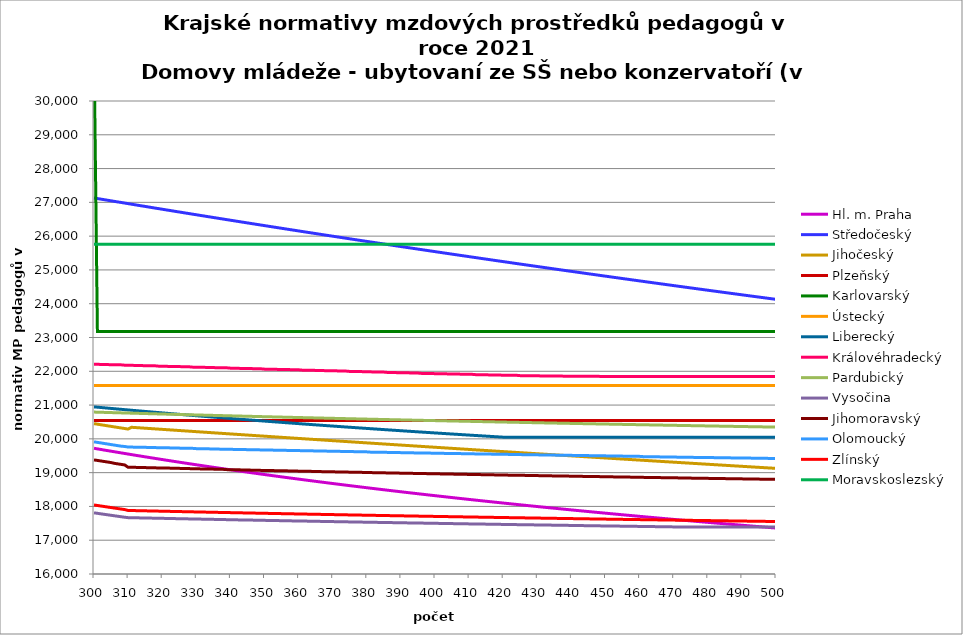
| Category | Hl. m. Praha | Středočeský | Jihočeský | Plzeňský | Karlovarský  | Ústecký   | Liberecký | Královéhradecký | Pardubický | Vysočina | Jihomoravský | Olomoucký | Zlínský | Moravskoslezský |
|---|---|---|---|---|---|---|---|---|---|---|---|---|---|---|
| 300.0 | 19720.871 | 27129.948 | 20450.699 | 20541.5 | 31680 | 21581.155 | 20946.754 | 22210.106 | 20792.359 | 17811.179 | 19377.234 | 19912.239 | 18043.404 | 25757.576 |
| 301.0 | 19703.422 | 27113.09 | 20434.307 | 20541.5 | 23180.488 | 21581.155 | 20937.493 | 22210.106 | 20789.4 | 17796.06 | 19361.435 | 19895.951 | 18027.918 | 25757.576 |
| 302.0 | 19686.062 | 27096.253 | 20417.995 | 20541.5 | 23180.488 | 21581.155 | 20928.27 | 22200.266 | 20786.452 | 17780.966 | 19345.662 | 19879.689 | 18012.509 | 25757.576 |
| 303.0 | 19668.79 | 27079.437 | 20401.764 | 20541.5 | 23180.488 | 21581.155 | 20919.086 | 22200.266 | 20783.515 | 17766.525 | 19329.915 | 19863.454 | 17997.178 | 25757.576 |
| 304.0 | 19651.605 | 27062.642 | 20385.611 | 20541.5 | 23180.488 | 21581.155 | 20909.94 | 22200.266 | 20780.588 | 17752.108 | 19314.193 | 19847.246 | 17981.923 | 25757.576 |
| 305.0 | 19634.506 | 27045.868 | 20369.537 | 20541.5 | 23180.488 | 21581.155 | 20900.832 | 22190.434 | 20777.672 | 17737.714 | 19298.497 | 19831.064 | 17966.744 | 25757.576 |
| 306.0 | 19617.492 | 27029.114 | 20353.541 | 20541.5 | 23180.488 | 21581.155 | 20891.761 | 22190.434 | 20774.766 | 17722.719 | 19275 | 19814.908 | 17951.64 | 25757.576 |
| 307.0 | 19600.564 | 27012.381 | 20337.622 | 20541.5 | 23180.488 | 21581.155 | 20882.728 | 22190.434 | 20771.87 | 17708.373 | 19259.367 | 19798.779 | 17936.611 | 25757.576 |
| 308.0 | 19583.719 | 26995.669 | 20321.779 | 20541.5 | 23180.488 | 21581.155 | 20873.733 | 22190.434 | 20768.985 | 17694.05 | 19243.76 | 19782.676 | 17921.655 | 25757.576 |
| 309.0 | 19566.958 | 26978.978 | 20306.013 | 20541.5 | 23180.488 | 21581.155 | 20864.774 | 22180.611 | 20766.109 | 17680.371 | 19228.178 | 19774.634 | 17906.773 | 25757.576 |
| 310.0 | 19550.28 | 26962.307 | 20290.321 | 20541.5 | 23180.488 | 21581.155 | 20855.852 | 22180.611 | 20763.244 | 17667.954 | 19158.37 | 19758.57 | 17880.706 | 25757.576 |
| 311.0 | 19533.683 | 26945.657 | 20342.45 | 20541.5 | 23180.488 | 21581.155 | 20846.966 | 22180.611 | 20760.389 | 17666.093 | 19158.37 | 19758.57 | 17878.46 | 25757.576 |
| 312.0 | 19517.168 | 26929.027 | 20335.61 | 20541.5 | 23180.488 | 21581.155 | 20838.116 | 22170.796 | 20757.543 | 17664.233 | 19158.37 | 19750.548 | 17876.221 | 25757.576 |
| 313.0 | 19500.734 | 26912.418 | 20328.774 | 20541.5 | 23180.488 | 21581.155 | 20829.302 | 22170.796 | 20754.708 | 17661.752 | 19150.645 | 19750.548 | 17873.991 | 25757.576 |
| 314.0 | 19484.379 | 26895.829 | 20321.943 | 20541.5 | 23180.488 | 21581.155 | 20820.523 | 22170.796 | 20751.882 | 17659.893 | 19150.645 | 19750.548 | 17871.768 | 25757.576 |
| 315.0 | 19468.104 | 26879.261 | 20315.116 | 20541.5 | 23180.488 | 21581.155 | 20811.78 | 22160.991 | 20749.066 | 17658.033 | 19150.645 | 19750.548 | 17869.553 | 25757.576 |
| 316.0 | 19451.907 | 26862.713 | 20308.293 | 20541.5 | 23180.488 | 21581.155 | 20803.072 | 22160.991 | 20746.26 | 17655.555 | 19142.926 | 19742.532 | 17867.345 | 25757.576 |
| 317.0 | 19435.789 | 26846.185 | 20301.476 | 20541.5 | 23180.488 | 21581.155 | 20794.398 | 22160.991 | 20743.463 | 17653.696 | 19142.926 | 19742.532 | 17865.145 | 25757.576 |
| 318.0 | 19419.747 | 26829.678 | 20294.663 | 20541.5 | 23180.488 | 21581.155 | 20785.759 | 22160.991 | 20740.676 | 17651.838 | 19142.926 | 19742.532 | 17862.952 | 25757.576 |
| 319.0 | 19403.783 | 26813.191 | 20287.854 | 20541.5 | 23180.488 | 21581.155 | 20777.155 | 22151.194 | 20737.899 | 17649.362 | 19135.214 | 19734.523 | 17860.767 | 25757.576 |
| 320.0 | 19387.894 | 26796.725 | 20281.05 | 20541.5 | 23180.488 | 21581.155 | 20768.584 | 22151.194 | 20735.131 | 17647.504 | 19135.214 | 19734.523 | 17858.589 | 25757.576 |
| 321.0 | 19372.081 | 26780.278 | 20274.251 | 20541.5 | 23180.488 | 21581.155 | 20760.047 | 22151.194 | 20732.372 | 17645.648 | 19135.214 | 19734.523 | 17856.419 | 25757.576 |
| 322.0 | 19356.343 | 26763.852 | 20267.456 | 20541.5 | 23180.488 | 21581.155 | 20751.544 | 22141.405 | 20729.623 | 17642.554 | 19135.214 | 19734.523 | 17854.255 | 25757.576 |
| 323.0 | 19340.679 | 26747.446 | 20260.666 | 20541.5 | 23180.488 | 21581.155 | 20743.074 | 22141.405 | 20726.882 | 17640.698 | 19127.507 | 19726.521 | 17852.099 | 25757.576 |
| 324.0 | 19325.088 | 26731.06 | 20253.88 | 20541.5 | 23180.488 | 21581.155 | 20734.637 | 22141.405 | 20724.151 | 17638.843 | 19127.507 | 19726.521 | 17849.95 | 25757.576 |
| 325.0 | 19309.571 | 26714.694 | 20247.099 | 20541.5 | 23180.488 | 21581.155 | 20726.232 | 22141.405 | 20721.43 | 17636.988 | 19127.507 | 19726.521 | 17847.809 | 25757.576 |
| 326.0 | 19294.126 | 26698.348 | 20240.323 | 20541.5 | 23180.488 | 21581.155 | 20717.861 | 22131.625 | 20718.717 | 17634.516 | 19119.807 | 19718.525 | 17845.674 | 25757.576 |
| 327.0 | 19278.753 | 26682.022 | 20233.55 | 20541.5 | 23180.488 | 21581.155 | 20709.522 | 22131.625 | 20716.013 | 17632.662 | 19119.807 | 19718.525 | 17843.547 | 25757.576 |
| 328.0 | 19263.452 | 26665.716 | 20226.783 | 20541.5 | 23180.488 | 21581.155 | 20701.214 | 22131.625 | 20713.318 | 17630.808 | 19119.807 | 19718.525 | 17841.426 | 25757.576 |
| 329.0 | 19248.221 | 26649.43 | 20220.02 | 20541.5 | 23180.488 | 21581.155 | 20692.939 | 22121.854 | 20710.632 | 17628.337 | 19112.113 | 19718.525 | 17839.312 | 25757.576 |
| 330.0 | 19233.06 | 26633.164 | 20213.261 | 20541.5 | 23180.488 | 21581.155 | 20684.696 | 22121.854 | 20707.955 | 17627.102 | 19112.113 | 19710.535 | 17837.206 | 25757.576 |
| 331.0 | 19217.969 | 26616.917 | 20206.507 | 20541.5 | 23180.488 | 21581.155 | 20676.484 | 22121.854 | 20705.287 | 17625.25 | 19112.113 | 19710.535 | 17835.106 | 25757.576 |
| 332.0 | 19202.947 | 26600.691 | 20199.758 | 20541.5 | 23180.488 | 21581.155 | 20668.303 | 22121.854 | 20702.627 | 17622.78 | 19104.425 | 19710.535 | 17833.013 | 25757.576 |
| 333.0 | 19187.993 | 26584.484 | 20193.013 | 20541.5 | 23180.488 | 21581.155 | 20660.153 | 22112.092 | 20699.977 | 17620.929 | 19104.425 | 19710.535 | 17830.927 | 25757.576 |
| 334.0 | 19173.107 | 26568.297 | 20186.272 | 20541.5 | 23180.488 | 21581.155 | 20652.035 | 22112.092 | 20697.334 | 17619.078 | 19104.425 | 19702.552 | 17828.847 | 25757.576 |
| 335.0 | 19158.289 | 26552.13 | 20179.536 | 20541.5 | 23180.488 | 21581.155 | 20643.946 | 22112.092 | 20694.701 | 17617.227 | 19104.425 | 19702.552 | 17826.774 | 25757.576 |
| 336.0 | 19143.538 | 26535.982 | 20172.805 | 20541.5 | 23180.488 | 21581.155 | 20635.889 | 22102.338 | 20692.076 | 17614.76 | 19096.743 | 19702.552 | 17824.708 | 25757.576 |
| 337.0 | 19128.854 | 26519.854 | 20166.078 | 20541.5 | 23180.488 | 21581.155 | 20627.861 | 22102.338 | 20689.459 | 17612.91 | 19096.743 | 19694.575 | 17822.649 | 25757.576 |
| 338.0 | 19114.235 | 26503.746 | 20159.356 | 20541.5 | 23180.488 | 21581.155 | 20619.863 | 22102.338 | 20686.851 | 17611.061 | 19096.743 | 19694.575 | 17820.596 | 25757.576 |
| 339.0 | 19099.682 | 26487.657 | 20152.638 | 20541.5 | 23180.488 | 21581.155 | 20611.896 | 22102.338 | 20684.251 | 17608.595 | 19089.068 | 19694.575 | 17818.549 | 25757.576 |
| 340.0 | 19085.193 | 26471.587 | 20145.924 | 20541.5 | 23180.488 | 21581.155 | 20603.957 | 22092.593 | 20681.659 | 17606.747 | 19089.068 | 19694.575 | 17816.509 | 25757.576 |
| 341.0 | 19070.769 | 26455.538 | 20139.215 | 20541.5 | 23180.488 | 21581.155 | 20596.049 | 22092.593 | 20679.076 | 17604.899 | 19089.068 | 19686.605 | 17814.476 | 25757.576 |
| 342.0 | 19056.409 | 26439.507 | 20132.51 | 20541.5 | 23180.488 | 21581.155 | 20588.169 | 22092.593 | 20676.501 | 17602.435 | 19089.068 | 19686.605 | 17812.449 | 25757.576 |
| 343.0 | 19042.112 | 26423.496 | 20125.81 | 20541.5 | 23180.488 | 21581.155 | 20580.318 | 22082.856 | 20673.934 | 17600.588 | 19081.398 | 19686.605 | 17810.428 | 25757.576 |
| 344.0 | 19027.879 | 26407.505 | 20119.114 | 20541.5 | 23180.488 | 21581.155 | 20572.497 | 22082.856 | 20671.375 | 17598.741 | 19081.398 | 19686.605 | 17808.414 | 25757.576 |
| 345.0 | 19013.708 | 26391.532 | 20112.423 | 20541.5 | 23180.488 | 21581.155 | 20564.703 | 22082.856 | 20668.824 | 17597.51 | 19081.398 | 19678.641 | 17806.406 | 25757.576 |
| 346.0 | 18999.598 | 26375.579 | 20105.736 | 20541.5 | 23180.488 | 21581.155 | 20556.939 | 22082.856 | 20666.281 | 17595.664 | 19073.735 | 19678.641 | 17804.404 | 25757.576 |
| 347.0 | 18985.551 | 26359.646 | 20099.054 | 20541.5 | 23180.488 | 21581.155 | 20549.202 | 22073.128 | 20663.746 | 17593.818 | 19073.735 | 19678.641 | 17802.409 | 25757.576 |
| 348.0 | 18971.564 | 26343.731 | 20092.376 | 20541.5 | 23180.488 | 21581.155 | 20541.494 | 22073.128 | 20661.219 | 17591.972 | 19073.735 | 19678.641 | 17800.419 | 25757.576 |
| 349.0 | 18957.638 | 26327.836 | 20085.703 | 20541.5 | 23180.488 | 21581.155 | 20533.813 | 22073.128 | 20658.7 | 17589.512 | 19066.078 | 19670.683 | 17798.436 | 25757.576 |
| 350.0 | 18943.773 | 26311.96 | 20079.034 | 20541.5 | 23180.488 | 21581.155 | 20526.16 | 22063.408 | 20656.189 | 17587.668 | 19066.078 | 19670.683 | 17796.459 | 25757.576 |
| 351.0 | 18929.967 | 26296.103 | 20072.369 | 20541.5 | 23180.488 | 21581.155 | 20518.535 | 22063.408 | 20653.686 | 17585.824 | 19066.078 | 19670.683 | 17794.488 | 25757.576 |
| 352.0 | 18916.22 | 26280.265 | 20065.709 | 20541.5 | 23180.488 | 21581.155 | 20510.937 | 22063.408 | 20651.19 | 17583.98 | 19066.078 | 19670.683 | 17792.523 | 25757.576 |
| 353.0 | 18902.532 | 26264.446 | 20059.053 | 20541.5 | 23180.488 | 21581.155 | 20503.366 | 22063.408 | 20648.702 | 17582.136 | 19058.427 | 19662.732 | 17790.564 | 25757.576 |
| 354.0 | 18888.903 | 26248.646 | 20052.402 | 20541.5 | 23180.488 | 21581.155 | 20495.822 | 22053.697 | 20646.221 | 17580.294 | 19058.427 | 19662.732 | 17788.611 | 25757.576 |
| 355.0 | 18875.332 | 26232.866 | 20045.755 | 20541.5 | 23180.488 | 21581.155 | 20488.305 | 22053.697 | 20643.749 | 17578.451 | 19058.427 | 19662.732 | 17786.664 | 25757.576 |
| 356.0 | 18861.818 | 26217.104 | 20039.112 | 20541.5 | 23180.488 | 21581.155 | 20480.815 | 22053.697 | 20641.283 | 17575.995 | 19058.427 | 19662.732 | 17784.723 | 25757.576 |
| 357.0 | 18848.361 | 26201.361 | 20032.474 | 20541.5 | 23180.488 | 21581.155 | 20473.351 | 22053.697 | 20638.826 | 17574.153 | 19050.782 | 19654.788 | 17782.788 | 25757.576 |
| 358.0 | 18834.961 | 26185.637 | 20025.841 | 20541.5 | 23180.488 | 21581.155 | 20465.913 | 22043.995 | 20636.375 | 17572.312 | 19050.782 | 19654.788 | 17780.858 | 25757.576 |
| 359.0 | 18821.618 | 26169.932 | 20019.211 | 20541.5 | 23180.488 | 21581.155 | 20458.502 | 22043.995 | 20633.932 | 17571.084 | 19050.782 | 19654.788 | 17778.935 | 25757.576 |
| 360.0 | 18808.33 | 26154.246 | 20012.586 | 20541.5 | 23180.488 | 21581.155 | 20451.116 | 22043.995 | 20631.497 | 17568.63 | 19043.144 | 19654.788 | 17777.017 | 25757.576 |
| 361.0 | 18795.098 | 26138.578 | 20005.966 | 20541.5 | 23180.488 | 21581.155 | 20443.756 | 22034.301 | 20629.069 | 17567.403 | 19043.144 | 19646.85 | 17775.104 | 25757.576 |
| 362.0 | 18781.921 | 26122.93 | 19999.349 | 20541.5 | 23180.488 | 21581.155 | 20436.422 | 22034.301 | 20626.648 | 17565.563 | 19043.144 | 19646.85 | 17773.198 | 25757.576 |
| 363.0 | 18768.799 | 26107.3 | 19992.738 | 20541.5 | 23180.488 | 21581.155 | 20429.113 | 22034.301 | 20624.234 | 17564.337 | 19043.144 | 19646.85 | 17771.297 | 25757.576 |
| 364.0 | 18755.731 | 26091.688 | 19986.13 | 20541.5 | 23180.488 | 21581.155 | 20421.83 | 22034.301 | 20621.828 | 17561.885 | 19035.511 | 19646.85 | 17769.402 | 25757.576 |
| 365.0 | 18742.717 | 26076.096 | 19979.527 | 20541.5 | 23180.488 | 21581.155 | 20414.572 | 22024.615 | 20619.428 | 17560.046 | 19035.511 | 19638.918 | 17767.513 | 25757.576 |
| 366.0 | 18729.757 | 26060.522 | 19972.928 | 20541.5 | 23180.488 | 21581.155 | 20407.338 | 22024.615 | 20617.036 | 17558.208 | 19035.511 | 19638.918 | 17765.629 | 25757.576 |
| 367.0 | 18716.85 | 26044.966 | 19966.334 | 20541.5 | 23180.488 | 21581.155 | 20400.13 | 22024.615 | 20614.651 | 17556.37 | 19027.885 | 19638.918 | 17763.75 | 25757.576 |
| 368.0 | 18703.996 | 26029.429 | 19959.744 | 20541.5 | 23180.488 | 21581.155 | 20392.946 | 22014.938 | 20612.273 | 17554.532 | 19027.885 | 19638.918 | 17761.877 | 25757.576 |
| 369.0 | 18691.194 | 26013.911 | 19953.158 | 20541.5 | 23180.488 | 21581.155 | 20385.787 | 22014.938 | 20609.902 | 17552.695 | 19027.885 | 19630.993 | 17760.01 | 25757.576 |
| 370.0 | 18678.444 | 25998.411 | 19946.577 | 20541.5 | 23180.488 | 21581.155 | 20378.652 | 22014.938 | 20607.538 | 17550.858 | 19027.885 | 19630.993 | 17758.148 | 25757.576 |
| 371.0 | 18665.746 | 25982.93 | 19940 | 20541.5 | 23180.488 | 21581.155 | 20371.542 | 22014.938 | 20605.18 | 17549.022 | 19020.264 | 19630.993 | 17756.291 | 25757.576 |
| 372.0 | 18653.099 | 25967.467 | 19933.427 | 20541.5 | 23180.488 | 21581.155 | 20364.455 | 22005.27 | 20602.83 | 17547.186 | 19020.264 | 19630.993 | 17754.44 | 25757.576 |
| 373.0 | 18640.504 | 25952.022 | 19926.859 | 20541.5 | 23180.488 | 21581.155 | 20357.393 | 22005.27 | 20600.487 | 17545.35 | 19020.264 | 19623.074 | 17752.594 | 25757.576 |
| 374.0 | 18627.959 | 25936.596 | 19920.295 | 20541.5 | 23180.488 | 21581.155 | 20350.354 | 22005.27 | 20598.15 | 17544.126 | 19020.264 | 19623.074 | 17750.754 | 25757.576 |
| 375.0 | 18615.464 | 25921.188 | 19913.736 | 20541.5 | 23180.488 | 21581.155 | 20343.339 | 21995.61 | 20595.82 | 17541.68 | 19012.65 | 19623.074 | 17748.918 | 25757.576 |
| 376.0 | 18603.019 | 25905.799 | 19907.18 | 20541.5 | 23180.488 | 21581.155 | 20336.347 | 21995.61 | 20593.497 | 17539.845 | 19012.65 | 19623.074 | 17747.088 | 25757.576 |
| 377.0 | 18590.624 | 25890.427 | 19900.629 | 20541.5 | 23180.488 | 21581.155 | 20329.379 | 21995.61 | 20591.18 | 17538.622 | 19012.65 | 19615.161 | 17745.264 | 25757.576 |
| 378.0 | 18578.278 | 25875.074 | 19894.082 | 20541.5 | 23180.488 | 21581.155 | 20322.434 | 21995.61 | 20588.871 | 17536.789 | 19012.65 | 19615.161 | 17743.444 | 25757.576 |
| 379.0 | 18565.981 | 25859.739 | 19887.54 | 20541.5 | 23180.488 | 21581.155 | 20315.512 | 21985.959 | 20586.567 | 17534.955 | 19005.042 | 19615.161 | 17741.63 | 25757.576 |
| 380.0 | 18553.733 | 25844.423 | 19881.002 | 20541.5 | 23180.488 | 21581.155 | 20308.613 | 21985.959 | 20584.271 | 17533.733 | 19005.042 | 19615.161 | 17739.821 | 25757.576 |
| 381.0 | 18541.533 | 25829.124 | 19874.468 | 20541.5 | 23180.488 | 21581.155 | 20301.737 | 21985.959 | 20581.981 | 17531.9 | 19005.042 | 19607.255 | 17738.016 | 25757.576 |
| 382.0 | 18529.381 | 25813.843 | 19867.939 | 20541.5 | 23180.488 | 21581.155 | 20294.883 | 21976.316 | 20579.697 | 17530.068 | 18997.44 | 19607.255 | 17736.217 | 25757.576 |
| 383.0 | 18517.277 | 25798.581 | 19861.413 | 20541.5 | 23180.488 | 21581.155 | 20288.052 | 21976.316 | 20577.42 | 17528.235 | 18997.44 | 19607.255 | 17734.424 | 25757.576 |
| 384.0 | 18505.219 | 25783.337 | 19854.892 | 20541.5 | 23180.488 | 21581.155 | 20281.243 | 21976.316 | 20575.149 | 17526.404 | 18997.44 | 19607.255 | 17732.635 | 25757.576 |
| 385.0 | 18493.209 | 25768.11 | 19848.376 | 20541.5 | 23180.488 | 21581.155 | 20274.457 | 21976.316 | 20572.885 | 17525.183 | 18997.44 | 19607.255 | 17730.851 | 25757.576 |
| 386.0 | 18481.246 | 25752.902 | 19841.863 | 20541.5 | 23180.488 | 21581.155 | 20267.693 | 21966.681 | 20570.627 | 17522.742 | 18989.844 | 19599.355 | 17729.072 | 25757.576 |
| 387.0 | 18469.329 | 25737.711 | 19835.355 | 20541.5 | 23180.488 | 21581.155 | 20260.95 | 21966.681 | 20568.376 | 17521.521 | 18989.844 | 19599.355 | 17727.298 | 25757.576 |
| 388.0 | 18457.458 | 25722.539 | 19828.851 | 20541.5 | 23180.488 | 21581.155 | 20254.23 | 21966.681 | 20566.13 | 17519.691 | 18989.844 | 19599.355 | 17725.529 | 25757.576 |
| 389.0 | 18445.632 | 25707.384 | 19822.352 | 20541.5 | 23180.488 | 21581.155 | 20247.531 | 21957.055 | 20563.891 | 17517.861 | 18989.844 | 19599.355 | 17723.765 | 25757.576 |
| 390.0 | 18433.853 | 25692.247 | 19815.857 | 20541.5 | 23180.488 | 21581.155 | 20240.854 | 21957.055 | 20561.659 | 17516.031 | 18982.254 | 19591.462 | 17722.006 | 25757.576 |
| 391.0 | 18422.118 | 25677.128 | 19809.365 | 20541.5 | 23180.488 | 21581.155 | 20234.198 | 21957.055 | 20559.432 | 17514.202 | 18982.254 | 19591.462 | 17720.251 | 25757.576 |
| 392.0 | 18410.428 | 25662.027 | 19802.879 | 20541.5 | 23180.488 | 21581.155 | 20227.564 | 21957.055 | 20557.212 | 17512.983 | 18982.254 | 19591.462 | 17718.502 | 25757.576 |
| 393.0 | 18398.783 | 25646.944 | 19796.396 | 20541.5 | 23180.488 | 21581.155 | 20220.951 | 21947.438 | 20554.998 | 17511.154 | 18982.254 | 19591.462 | 17716.757 | 25757.576 |
| 394.0 | 18387.182 | 25631.878 | 19789.918 | 20541.5 | 23180.488 | 21581.155 | 20214.359 | 21947.438 | 20552.789 | 17509.326 | 18974.67 | 19583.575 | 17715.017 | 25757.576 |
| 395.0 | 18375.624 | 25616.83 | 19783.444 | 20541.5 | 23180.488 | 21581.155 | 20207.788 | 21947.438 | 20550.587 | 17507.499 | 18974.67 | 19583.575 | 17713.282 | 25757.576 |
| 396.0 | 18364.111 | 25601.799 | 19776.974 | 20541.5 | 23180.488 | 21581.155 | 20201.238 | 21937.828 | 20548.391 | 17506.889 | 18974.67 | 19583.575 | 17711.551 | 25757.576 |
| 397.0 | 18352.641 | 25586.787 | 19770.508 | 20541.5 | 23180.488 | 21581.155 | 20194.709 | 21937.828 | 20546.201 | 17505.062 | 18974.67 | 19583.575 | 17709.826 | 25757.576 |
| 398.0 | 18341.214 | 25571.791 | 19764.047 | 20541.5 | 23180.488 | 21581.155 | 20188.2 | 21937.828 | 20544.017 | 17503.235 | 18967.093 | 19583.575 | 17708.105 | 25757.576 |
| 399.0 | 18329.83 | 25556.814 | 19757.59 | 20541.5 | 23180.488 | 21581.155 | 20181.712 | 21937.828 | 20541.839 | 17501.409 | 18967.093 | 19575.694 | 17706.388 | 25757.576 |
| 400.0 | 18318.489 | 25541.854 | 19751.137 | 20541.5 | 23180.488 | 21581.155 | 20175.244 | 21928.228 | 20539.667 | 17500.191 | 18967.093 | 19575.694 | 17704.676 | 25757.576 |
| 401.0 | 18307.19 | 25526.911 | 19744.688 | 20541.5 | 23180.488 | 21581.155 | 20168.797 | 21928.228 | 20537.501 | 17498.365 | 18967.093 | 19575.694 | 17702.969 | 25757.576 |
| 402.0 | 18295.932 | 25511.986 | 19738.243 | 20541.5 | 23180.488 | 21581.155 | 20162.37 | 21928.228 | 20535.34 | 17496.54 | 18959.521 | 19575.694 | 17701.267 | 25757.576 |
| 403.0 | 18284.717 | 25497.078 | 19731.803 | 20541.5 | 23180.488 | 21581.155 | 20155.962 | 21928.228 | 20533.186 | 17494.715 | 18959.521 | 19567.82 | 17699.568 | 25757.576 |
| 404.0 | 18273.543 | 25482.188 | 19725.367 | 20541.5 | 23180.488 | 21581.155 | 20149.575 | 21918.635 | 20531.037 | 17493.498 | 18959.521 | 19567.82 | 17697.875 | 25757.576 |
| 405.0 | 18262.41 | 25467.315 | 19718.935 | 20541.5 | 23180.488 | 21581.155 | 20143.208 | 21918.635 | 20528.894 | 17491.674 | 18959.521 | 19567.82 | 17696.186 | 25757.576 |
| 406.0 | 18251.319 | 25452.46 | 19712.507 | 20541.5 | 23180.488 | 21581.155 | 20136.86 | 21918.635 | 20526.756 | 17489.85 | 18951.955 | 19567.82 | 17694.501 | 25757.576 |
| 407.0 | 18240.268 | 25437.621 | 19706.084 | 20541.5 | 23180.488 | 21581.155 | 20130.532 | 21918.635 | 20524.625 | 17488.026 | 18951.955 | 19567.82 | 17692.821 | 25757.576 |
| 408.0 | 18229.257 | 25422.801 | 19699.664 | 20541.5 | 23180.488 | 21581.155 | 20124.223 | 21909.051 | 20522.499 | 17486.811 | 18951.955 | 19559.952 | 17691.146 | 25757.576 |
| 409.0 | 18218.287 | 25407.997 | 19693.249 | 20541.5 | 23180.488 | 21581.155 | 20117.934 | 21909.051 | 20520.378 | 17484.987 | 18951.955 | 19559.952 | 17689.474 | 25757.576 |
| 410.0 | 18207.356 | 25393.21 | 19686.838 | 20541.5 | 23180.488 | 21581.155 | 20111.664 | 21909.051 | 20518.264 | 17483.165 | 18944.396 | 19559.952 | 17687.808 | 25757.576 |
| 411.0 | 18196.465 | 25378.441 | 19680.431 | 20541.5 | 23180.488 | 21581.155 | 20105.413 | 21909.051 | 20516.155 | 17481.343 | 18944.396 | 19559.952 | 17686.145 | 25757.576 |
| 412.0 | 18185.614 | 25363.689 | 19674.029 | 20541.5 | 23180.488 | 21581.155 | 20099.181 | 21899.476 | 20514.051 | 17480.128 | 18944.396 | 19552.09 | 17684.487 | 25757.576 |
| 413.0 | 18174.802 | 25348.954 | 19667.63 | 20541.5 | 23180.488 | 21581.155 | 20092.968 | 21899.476 | 20511.953 | 17478.913 | 18944.396 | 19552.09 | 17682.833 | 25757.576 |
| 414.0 | 18164.029 | 25334.237 | 19661.236 | 20541.5 | 23180.488 | 21581.155 | 20086.774 | 21899.476 | 20509.86 | 17477.092 | 18936.842 | 19552.09 | 17681.184 | 25757.576 |
| 415.0 | 18153.294 | 25319.536 | 19654.846 | 20541.5 | 23180.488 | 21581.155 | 20080.599 | 21899.476 | 20507.773 | 17475.878 | 18936.842 | 19552.09 | 17679.539 | 25757.576 |
| 416.0 | 18142.598 | 25304.852 | 19648.46 | 20541.5 | 23180.488 | 21581.155 | 20074.442 | 21889.908 | 20505.692 | 17474.057 | 18936.842 | 19552.09 | 17677.898 | 25757.576 |
| 417.0 | 18131.94 | 25290.185 | 19642.078 | 20541.5 | 23180.488 | 21581.155 | 20068.304 | 21889.908 | 20503.615 | 17472.843 | 18936.842 | 19544.235 | 17676.261 | 25757.576 |
| 418.0 | 18121.321 | 25275.536 | 19635.7 | 20541.5 | 23180.488 | 21581.155 | 20062.184 | 21889.908 | 20501.545 | 17471.023 | 18929.295 | 19544.235 | 17674.629 | 25757.576 |
| 419.0 | 18110.739 | 25260.903 | 19629.326 | 20541.5 | 23180.488 | 21581.155 | 20056.083 | 21889.908 | 20499.479 | 17469.204 | 18929.295 | 19544.235 | 17673 | 25757.576 |
| 420.0 | 18100.194 | 25246.287 | 19622.957 | 20541.5 | 23180.488 | 21581.155 | 20050 | 21880.349 | 20497.419 | 17467.991 | 18929.295 | 19544.235 | 17671.376 | 25757.576 |
| 421.0 | 18089.687 | 25231.689 | 19616.592 | 20541.5 | 23180.488 | 21581.155 | 20050 | 21880.349 | 20495.364 | 17466.171 | 18929.295 | 19544.235 | 17669.756 | 25757.576 |
| 422.0 | 18079.217 | 25217.107 | 19610.23 | 20541.5 | 23180.488 | 21581.155 | 20050 | 21880.349 | 20493.315 | 17464.353 | 18921.753 | 19536.386 | 17668.141 | 25757.576 |
| 423.0 | 18068.784 | 25202.541 | 19603.873 | 20541.5 | 23180.488 | 21581.155 | 20050 | 21880.349 | 20491.27 | 17463.14 | 18921.753 | 19536.386 | 17666.529 | 25757.576 |
| 424.0 | 18058.387 | 25187.993 | 19597.52 | 20541.5 | 23180.488 | 21581.155 | 20050 | 21880.349 | 20489.231 | 17461.322 | 18921.753 | 19536.386 | 17664.921 | 25757.576 |
| 425.0 | 18048.027 | 25173.462 | 19591.172 | 20541.5 | 23180.488 | 21581.155 | 20050 | 21870.799 | 20487.198 | 17460.11 | 18921.753 | 19536.386 | 17663.318 | 25757.576 |
| 426.0 | 18037.703 | 25158.947 | 19584.827 | 20541.5 | 23180.488 | 21581.155 | 20050 | 21870.799 | 20485.169 | 17458.899 | 18921.753 | 19528.543 | 17661.718 | 25757.576 |
| 427.0 | 18027.415 | 25144.449 | 19578.486 | 20541.5 | 23180.488 | 21581.155 | 20050 | 21870.799 | 20483.145 | 17456.476 | 18914.217 | 19528.543 | 17660.123 | 25757.576 |
| 428.0 | 18017.162 | 25129.967 | 19572.15 | 20541.5 | 23180.488 | 21581.155 | 20050 | 21870.799 | 20481.127 | 17455.265 | 18914.217 | 19528.543 | 17658.532 | 25757.576 |
| 429.0 | 18006.946 | 25115.503 | 19565.817 | 20541.5 | 23180.488 | 21581.155 | 20050 | 21870.799 | 20479.114 | 17454.053 | 18914.217 | 19528.543 | 17656.944 | 25757.576 |
| 430.0 | 17996.764 | 25101.055 | 19559.489 | 20541.5 | 23180.488 | 21581.155 | 20050 | 21870.799 | 20477.106 | 17452.237 | 18914.217 | 19528.543 | 17655.361 | 25757.576 |
| 431.0 | 17986.618 | 25086.623 | 19553.165 | 20541.5 | 23180.488 | 21581.155 | 20050 | 21861.257 | 20475.103 | 17450.421 | 18906.688 | 19520.706 | 17653.782 | 25757.576 |
| 432.0 | 17976.506 | 25072.208 | 19546.845 | 20541.5 | 23180.488 | 21581.155 | 20050 | 21861.257 | 20473.105 | 17449.211 | 18906.688 | 19520.706 | 17652.206 | 25757.576 |
| 433.0 | 17966.43 | 25057.81 | 19540.529 | 20541.5 | 23180.488 | 21581.155 | 20050 | 21861.257 | 20471.111 | 17448.001 | 18906.688 | 19520.706 | 17650.635 | 25757.576 |
| 434.0 | 17956.387 | 25043.428 | 19534.217 | 20541.5 | 23180.488 | 21581.155 | 20050 | 21861.257 | 20469.123 | 17446.791 | 18906.688 | 19520.706 | 17649.067 | 25757.576 |
| 435.0 | 17946.379 | 25029.063 | 19527.909 | 20541.5 | 23180.488 | 21581.155 | 20050 | 21861.257 | 20467.14 | 17444.976 | 18899.164 | 19520.706 | 17647.503 | 25757.576 |
| 436.0 | 17936.406 | 25014.714 | 19521.605 | 20541.5 | 23180.488 | 21581.155 | 20050 | 21861.257 | 20465.162 | 17443.162 | 18899.164 | 19512.876 | 17645.943 | 25757.576 |
| 437.0 | 17926.466 | 25000.382 | 19515.305 | 20541.5 | 23180.488 | 21581.155 | 20050 | 21861.257 | 20463.189 | 17441.952 | 18899.164 | 19512.876 | 17644.387 | 25757.576 |
| 438.0 | 17916.559 | 24986.066 | 19509.01 | 20541.5 | 23180.488 | 21581.155 | 20050 | 21851.723 | 20461.22 | 17440.743 | 18899.164 | 19512.876 | 17642.835 | 25757.576 |
| 439.0 | 17906.687 | 24971.767 | 19502.718 | 20541.5 | 23180.488 | 21581.155 | 20050 | 21851.723 | 20459.257 | 17439.534 | 18899.164 | 19512.876 | 17641.287 | 25757.576 |
| 440.0 | 17896.847 | 24957.483 | 19496.43 | 20541.5 | 23180.488 | 21581.155 | 20050 | 21851.723 | 20457.298 | 17437.117 | 18891.647 | 19512.876 | 17639.742 | 25757.576 |
| 441.0 | 17887.041 | 24943.216 | 19490.147 | 20541.5 | 23180.488 | 21581.155 | 20050 | 21851.723 | 20455.344 | 17435.908 | 18891.647 | 19505.052 | 17638.201 | 25757.576 |
| 442.0 | 17877.267 | 24928.966 | 19483.867 | 20541.5 | 23180.488 | 21581.155 | 20050 | 21851.723 | 20453.395 | 17434.7 | 18891.647 | 19505.052 | 17636.664 | 25757.576 |
| 443.0 | 17867.527 | 24914.732 | 19477.592 | 20541.5 | 23180.488 | 21581.155 | 20050 | 21851.723 | 20451.451 | 17432.888 | 18891.647 | 19505.052 | 17635.131 | 25757.576 |
| 444.0 | 17857.819 | 24900.514 | 19471.321 | 20541.5 | 23180.488 | 21581.155 | 20050 | 21851.723 | 20449.512 | 17431.076 | 18884.135 | 19505.052 | 17633.601 | 25757.576 |
| 445.0 | 17848.143 | 24886.312 | 19465.053 | 20541.5 | 23180.488 | 21581.155 | 20050 | 21851.723 | 20447.577 | 17429.868 | 18884.135 | 19505.052 | 17632.075 | 25757.576 |
| 446.0 | 17838.499 | 24872.126 | 19458.79 | 20541.5 | 23180.488 | 21581.155 | 20050 | 21851.723 | 20445.647 | 17428.661 | 18884.135 | 19497.234 | 17630.553 | 25757.576 |
| 447.0 | 17828.887 | 24857.957 | 19452.531 | 20541.5 | 23180.488 | 21581.155 | 20050 | 21851.723 | 20443.721 | 17426.85 | 18884.135 | 19497.234 | 17629.034 | 25757.576 |
| 448.0 | 17819.308 | 24843.803 | 19446.275 | 20541.5 | 23180.488 | 21581.155 | 20050 | 21851.723 | 20441.801 | 17425.039 | 18884.135 | 19497.234 | 17627.52 | 25757.576 |
| 449.0 | 17809.759 | 24829.666 | 19440.024 | 20541.5 | 23180.488 | 21581.155 | 20050 | 21842.197 | 20439.884 | 17423.832 | 18876.63 | 19497.234 | 17626.008 | 25757.576 |
| 450.0 | 17800.242 | 24815.545 | 19433.777 | 20541.5 | 23180.488 | 21581.155 | 20050 | 21842.197 | 20437.973 | 17422.625 | 18876.63 | 19497.234 | 17624.501 | 25757.576 |
| 451.0 | 17790.757 | 24801.44 | 19427.534 | 20541.5 | 23180.488 | 21581.155 | 20050 | 21842.197 | 20436.066 | 17421.419 | 18876.63 | 19489.423 | 17622.997 | 25757.576 |
| 452.0 | 17781.302 | 24787.351 | 19421.294 | 20541.5 | 23180.488 | 21581.155 | 20050 | 21842.197 | 20434.164 | 17419.609 | 18876.63 | 19489.423 | 17621.496 | 25757.576 |
| 453.0 | 17771.879 | 24773.278 | 19415.059 | 20541.5 | 23180.488 | 21581.155 | 20050 | 21842.197 | 20432.266 | 17418.403 | 18869.13 | 19489.423 | 17619.999 | 25757.576 |
| 454.0 | 17762.486 | 24759.221 | 19408.828 | 20541.5 | 23180.488 | 21581.155 | 20050 | 21842.197 | 20430.373 | 17417.197 | 18869.13 | 19489.423 | 17618.506 | 25757.576 |
| 455.0 | 17753.124 | 24745.18 | 19402.601 | 20541.5 | 23180.488 | 21581.155 | 20050 | 21842.197 | 20428.484 | 17415.992 | 18869.13 | 19489.423 | 17617.016 | 25757.576 |
| 456.0 | 17743.792 | 24731.154 | 19396.378 | 20541.5 | 23180.488 | 21581.155 | 20050 | 21842.197 | 20426.6 | 17414.786 | 18869.13 | 19481.618 | 17615.53 | 25757.576 |
| 457.0 | 17734.49 | 24717.145 | 19390.159 | 20541.5 | 23180.488 | 21581.155 | 20050 | 21842.197 | 20424.72 | 17412.375 | 18869.13 | 19481.618 | 17614.047 | 25757.576 |
| 458.0 | 17725.218 | 24703.152 | 19383.943 | 20541.5 | 23180.488 | 21581.155 | 20050 | 21842.197 | 20422.845 | 17411.17 | 18861.636 | 19481.618 | 17612.568 | 25757.576 |
| 459.0 | 17715.977 | 24689.174 | 19377.732 | 20541.5 | 23180.488 | 21581.155 | 20050 | 21842.197 | 20420.974 | 17409.965 | 18861.636 | 19481.618 | 17611.092 | 25757.576 |
| 460.0 | 17706.765 | 24675.212 | 19371.525 | 20541.5 | 23180.488 | 21581.155 | 20050 | 21842.197 | 20419.108 | 17408.761 | 18861.636 | 19481.618 | 17609.62 | 25757.576 |
| 461.0 | 17697.582 | 24661.266 | 19365.322 | 20541.5 | 23180.488 | 21581.155 | 20050 | 21842.197 | 20417.246 | 17407.556 | 18861.636 | 19473.819 | 17608.151 | 25757.576 |
| 462.0 | 17688.429 | 24647.336 | 19359.122 | 20541.5 | 23180.488 | 21581.155 | 20050 | 21842.197 | 20415.388 | 17405.147 | 18854.148 | 19473.819 | 17606.685 | 25757.576 |
| 463.0 | 17679.305 | 24633.421 | 19352.927 | 20541.5 | 23180.488 | 21581.155 | 20050 | 21842.197 | 20413.535 | 17403.943 | 18854.148 | 19473.819 | 17605.223 | 25757.576 |
| 464.0 | 17670.21 | 24619.522 | 19346.736 | 20541.5 | 23180.488 | 21581.155 | 20050 | 21842.197 | 20411.686 | 17402.739 | 18854.148 | 19473.819 | 17603.765 | 25757.576 |
| 465.0 | 17661.144 | 24605.639 | 19340.548 | 20541.5 | 23180.488 | 21581.155 | 20050 | 21842.197 | 20409.841 | 17401.536 | 18854.148 | 19473.819 | 17602.309 | 25757.576 |
| 466.0 | 17652.107 | 24591.772 | 19334.365 | 20541.5 | 23180.488 | 21581.155 | 20050 | 21842.197 | 20408.001 | 17400.332 | 18854.148 | 19466.026 | 17600.857 | 25757.576 |
| 467.0 | 17643.098 | 24577.92 | 19328.185 | 20541.5 | 23180.488 | 21581.155 | 20050 | 21842.197 | 20406.165 | 17398.527 | 18846.667 | 19466.026 | 17599.409 | 25757.576 |
| 468.0 | 17634.118 | 24564.083 | 19322.01 | 20541.5 | 23180.488 | 21581.155 | 20050 | 21842.197 | 20404.333 | 17397.324 | 18846.667 | 19466.026 | 17597.964 | 25757.576 |
| 469.0 | 17625.166 | 24550.263 | 19315.838 | 20541.5 | 23180.488 | 21581.155 | 20050 | 21842.197 | 20402.505 | 17395.519 | 18846.667 | 19466.026 | 17596.522 | 25757.576 |
| 470.0 | 17616.243 | 24536.457 | 19309.67 | 20541.5 | 23180.488 | 21581.155 | 20050 | 21842.197 | 20400.682 | 17394.317 | 18846.667 | 19466.026 | 17595.083 | 25757.576 |
| 471.0 | 17607.347 | 24522.668 | 19303.507 | 20541.5 | 23180.488 | 21581.155 | 20050 | 21842.197 | 20398.863 | 17394.317 | 18846.667 | 19458.24 | 17593.648 | 25757.576 |
| 472.0 | 17598.479 | 24508.893 | 19297.347 | 20541.5 | 23180.488 | 21581.155 | 20050 | 21842.197 | 20397.048 | 17394.317 | 18839.191 | 19458.24 | 17592.216 | 25757.576 |
| 473.0 | 17589.638 | 24495.135 | 19291.191 | 20541.5 | 23180.488 | 21581.155 | 20050 | 21842.197 | 20395.237 | 17394.317 | 18839.191 | 19458.24 | 17590.787 | 25757.576 |
| 474.0 | 17580.826 | 24481.391 | 19285.039 | 20541.5 | 23180.488 | 21581.155 | 20050 | 21842.197 | 20393.43 | 17394.317 | 18839.191 | 19458.24 | 17589.362 | 25757.576 |
| 475.0 | 17572.04 | 24467.664 | 19278.891 | 20541.5 | 23180.488 | 21581.155 | 20050 | 21842.197 | 20391.628 | 17394.317 | 18839.191 | 19458.24 | 17587.939 | 25757.576 |
| 476.0 | 17563.282 | 24453.951 | 19272.747 | 20541.5 | 23180.488 | 21581.155 | 20050 | 21842.197 | 20389.829 | 17394.317 | 18831.721 | 19450.46 | 17586.52 | 25757.576 |
| 477.0 | 17554.551 | 24440.254 | 19266.607 | 20541.5 | 23180.488 | 21581.155 | 20050 | 21842.197 | 20388.035 | 17394.317 | 18831.721 | 19450.46 | 17585.104 | 25757.576 |
| 478.0 | 17545.847 | 24426.572 | 19260.47 | 20541.5 | 23180.488 | 21581.155 | 20050 | 21842.197 | 20386.245 | 17394.317 | 18831.721 | 19450.46 | 17583.692 | 25757.576 |
| 479.0 | 17537.169 | 24412.906 | 19254.338 | 20541.5 | 23180.488 | 21581.155 | 20050 | 21842.197 | 20384.458 | 17394.317 | 18831.721 | 19450.46 | 17582.282 | 25757.576 |
| 480.0 | 17528.519 | 24399.254 | 19248.21 | 20541.5 | 23180.488 | 21581.155 | 20050 | 21842.197 | 20382.676 | 17394.317 | 18831.721 | 19450.46 | 17580.876 | 25757.576 |
| 481.0 | 17519.894 | 24385.618 | 19242.085 | 20541.5 | 23180.488 | 21581.155 | 20050 | 21842.197 | 20380.898 | 17394.317 | 18824.257 | 19450.46 | 17579.473 | 25757.576 |
| 482.0 | 17511.296 | 24371.998 | 19235.964 | 20541.5 | 23180.488 | 21581.155 | 20050 | 21842.197 | 20379.124 | 17394.317 | 18824.257 | 19442.686 | 17578.073 | 25757.576 |
| 483.0 | 17502.725 | 24358.392 | 19229.848 | 20541.5 | 23180.488 | 21581.155 | 20050 | 21842.197 | 20377.354 | 17394.317 | 18824.257 | 19442.686 | 17576.676 | 25757.576 |
| 484.0 | 17494.179 | 24344.802 | 19223.735 | 20541.5 | 23180.488 | 21581.155 | 20050 | 21842.197 | 20375.588 | 17394.317 | 18824.257 | 19442.686 | 17575.282 | 25757.576 |
| 485.0 | 17485.66 | 24331.227 | 19217.626 | 20541.5 | 23180.488 | 21581.155 | 20050 | 21842.197 | 20373.825 | 17394.317 | 18824.257 | 19442.686 | 17573.891 | 25757.576 |
| 486.0 | 17477.166 | 24317.667 | 19211.521 | 20541.5 | 23180.488 | 21581.155 | 20050 | 21842.197 | 20372.067 | 17394.317 | 18816.799 | 19442.686 | 17572.504 | 25757.576 |
| 487.0 | 17468.698 | 24304.122 | 19205.419 | 20541.5 | 23180.488 | 21581.155 | 20050 | 21842.197 | 20370.313 | 17394.317 | 18816.799 | 19434.918 | 17571.119 | 25757.576 |
| 488.0 | 17460.255 | 24290.592 | 19199.322 | 20541.5 | 23180.488 | 21581.155 | 20050 | 21842.197 | 20368.562 | 17394.317 | 18816.799 | 19434.918 | 17569.738 | 25757.576 |
| 489.0 | 17451.838 | 24277.077 | 19193.228 | 20541.5 | 23180.488 | 21581.155 | 20050 | 21842.197 | 20366.815 | 17394.317 | 18816.799 | 19434.918 | 17568.359 | 25757.576 |
| 490.0 | 17443.446 | 24263.577 | 19187.139 | 20541.5 | 23180.488 | 21581.155 | 20050 | 21842.197 | 20365.073 | 17394.317 | 18816.799 | 19434.918 | 17566.984 | 25757.576 |
| 491.0 | 17435.079 | 24250.093 | 19181.053 | 20541.5 | 23180.488 | 21581.155 | 20050 | 21842.197 | 20363.334 | 17394.317 | 18809.347 | 19434.918 | 17565.612 | 25757.576 |
| 492.0 | 17426.738 | 24236.623 | 19174.971 | 20541.5 | 23180.488 | 21581.155 | 20050 | 21842.197 | 20361.599 | 17394.317 | 18809.347 | 19434.918 | 17564.242 | 25757.576 |
| 493.0 | 17418.421 | 24223.168 | 19168.893 | 20541.5 | 23180.488 | 21581.155 | 20050 | 21842.197 | 20359.867 | 17394.317 | 18809.347 | 19427.157 | 17562.876 | 25757.576 |
| 494.0 | 17410.129 | 24209.728 | 19162.819 | 20541.5 | 23180.488 | 21581.155 | 20050 | 21842.197 | 20358.14 | 17394.317 | 18809.347 | 19427.157 | 17561.512 | 25757.576 |
| 495.0 | 17401.861 | 24196.303 | 19156.749 | 20541.5 | 23180.488 | 21581.155 | 20050 | 21842.197 | 20356.416 | 17394.317 | 18809.347 | 19427.157 | 17560.152 | 25757.576 |
| 496.0 | 17393.618 | 24182.893 | 19150.682 | 20541.5 | 23180.488 | 21581.155 | 20050 | 21842.197 | 20354.696 | 17394.317 | 18801.9 | 19427.157 | 17558.794 | 25757.576 |
| 497.0 | 17385.4 | 24169.498 | 19144.619 | 20541.5 | 23180.488 | 21581.155 | 20050 | 21842.197 | 20352.98 | 17394.317 | 18801.9 | 19427.157 | 17557.44 | 25757.576 |
| 498.0 | 17377.206 | 24156.117 | 19138.561 | 20541.5 | 23180.488 | 21581.155 | 20050 | 21842.197 | 20351.268 | 17394.317 | 18801.9 | 19419.401 | 17556.088 | 25757.576 |
| 499.0 | 17369.036 | 24142.752 | 19132.506 | 20541.5 | 23180.488 | 21581.155 | 20050 | 21842.197 | 20349.559 | 17394.317 | 18801.9 | 19419.401 | 17554.74 | 25757.576 |
| 500.0 | 17360.889 | 24129.401 | 19126.454 | 20541.5 | 23180.488 | 21581.155 | 20050 | 21842.197 | 20347.854 | 17394.317 | 18801.9 | 19419.401 | 17553.394 | 25757.576 |